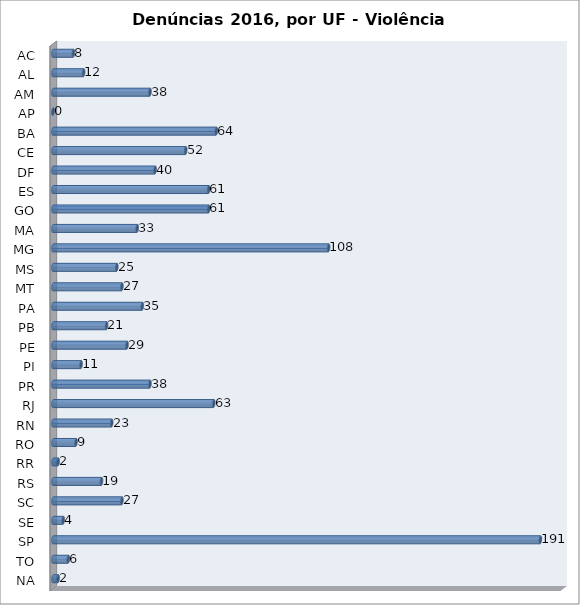
| Category | Series 0 |
|---|---|
| AC | 8 |
| AL | 12 |
| AM | 38 |
| AP | 0 |
| BA | 64 |
| CE | 52 |
| DF | 40 |
| ES | 61 |
| GO | 61 |
| MA | 33 |
| MG | 108 |
| MS | 25 |
| MT | 27 |
| PA | 35 |
| PB | 21 |
| PE | 29 |
| PI | 11 |
| PR | 38 |
| RJ | 63 |
| RN | 23 |
| RO | 9 |
| RR | 2 |
| RS | 19 |
| SC | 27 |
| SE | 4 |
| SP | 191 |
| TO | 6 |
| NA | 2 |